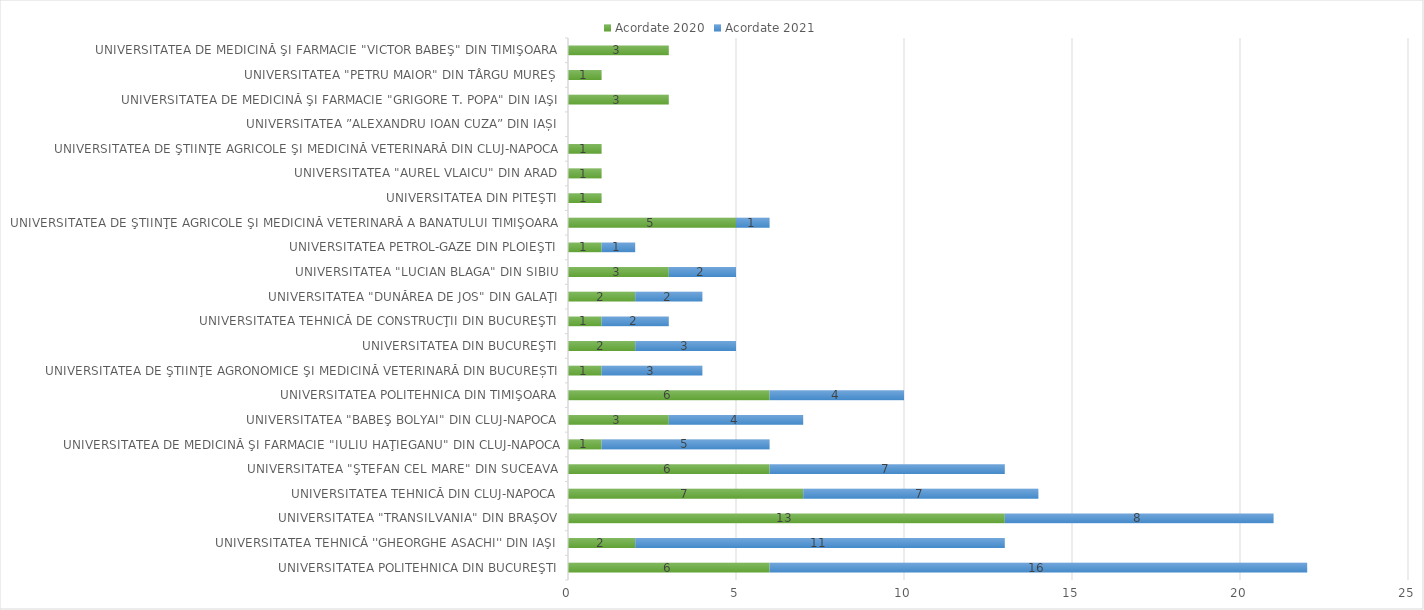
| Category | Acordate 2020 | Acordate 2021 |
|---|---|---|
| UNIVERSITATEA POLITEHNICA DIN BUCUREŞTI | 6 | 16 |
| UNIVERSITATEA TEHNICĂ ''GHEORGHE ASACHI'' DIN IAŞI | 2 | 11 |
| UNIVERSITATEA "TRANSILVANIA" DIN BRAŞOV | 13 | 8 |
| UNIVERSITATEA TEHNICĂ DIN CLUJ-NAPOCA | 7 | 7 |
| UNIVERSITATEA "ŞTEFAN CEL MARE" DIN SUCEAVA | 6 | 7 |
| UNIVERSITATEA DE MEDICINĂ ŞI FARMACIE "IULIU HAŢIEGANU" DIN CLUJ-NAPOCA | 1 | 5 |
| UNIVERSITATEA "BABEŞ BOLYAI" DIN CLUJ-NAPOCA | 3 | 4 |
| UNIVERSITATEA POLITEHNICA DIN TIMIŞOARA | 6 | 4 |
| UNIVERSITATEA DE ŞTIINŢE AGRONOMICE ŞI MEDICINĂ VETERINARĂ DIN BUCUREȘTI | 1 | 3 |
| UNIVERSITATEA DIN BUCUREŞTI | 2 | 3 |
| UNIVERSITATEA TEHNICĂ DE CONSTRUCŢII DIN BUCUREŞTI | 1 | 2 |
| UNIVERSITATEA "DUNĂREA DE JOS" DIN GALAŢI | 2 | 2 |
| UNIVERSITATEA "LUCIAN BLAGA" DIN SIBIU | 3 | 2 |
| UNIVERSITATEA PETROL-GAZE DIN PLOIEŞTI | 1 | 1 |
| UNIVERSITATEA DE ŞTIINŢE AGRICOLE ŞI MEDICINĂ VETERINARĂ A BANATULUI TIMIŞOARA | 5 | 1 |
| UNIVERSITATEA DIN PITEŞTI | 1 | 0 |
| UNIVERSITATEA "AUREL VLAICU" DIN ARAD | 1 | 0 |
| UNIVERSITATEA DE ŞTIINŢE AGRICOLE ŞI MEDICINĂ VETERINARĂ DIN CLUJ-NAPOCA | 1 | 0 |
| UNIVERSITATEA ”ALEXANDRU IOAN CUZA” DIN IAȘI | 0 | 0 |
| UNIVERSITATEA DE MEDICINĂ ŞI FARMACIE "GRIGORE T. POPA" DIN IAŞI | 3 | 0 |
| UNIVERSITATEA "PETRU MAIOR" DIN TÂRGU MUREȘ | 1 | 0 |
| UNIVERSITATEA DE MEDICINĂ ŞI FARMACIE "VICTOR BABEŞ" DIN TIMIŞOARA | 3 | 0 |